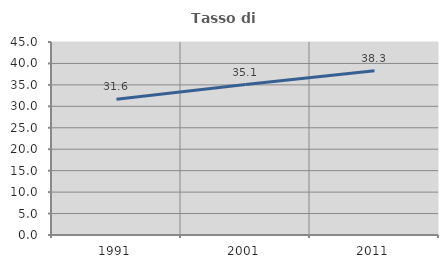
| Category | Tasso di occupazione   |
|---|---|
| 1991.0 | 31.632 |
| 2001.0 | 35.09 |
| 2011.0 | 38.287 |